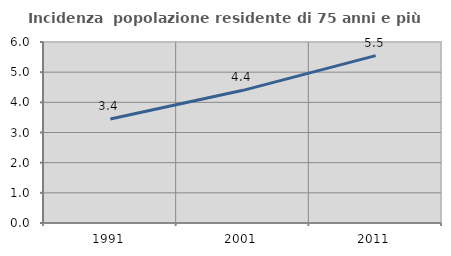
| Category | Incidenza  popolazione residente di 75 anni e più |
|---|---|
| 1991.0 | 3.449 |
| 2001.0 | 4.398 |
| 2011.0 | 5.549 |